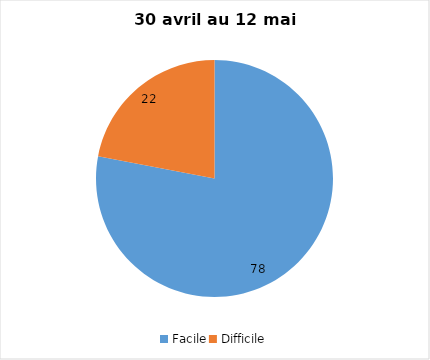
| Category | Series 0 |
|---|---|
| Facile | 78 |
| Difficile | 22 |